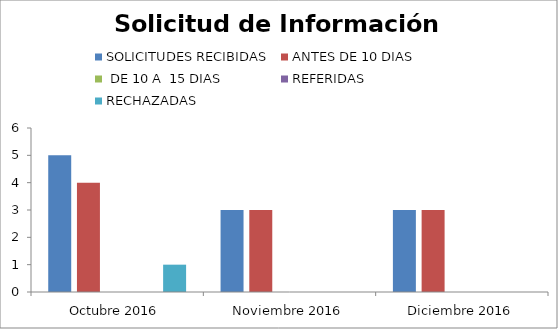
| Category | SOLICITUDES RECIBIDAS | ANTES DE 10 DIAS |  DE 10 A  15 DIAS  | REFERIDAS | RECHAZADAS |
|---|---|---|---|---|---|
| Octubre 2016 | 5 | 4 | 0 | 0 | 1 |
| Noviembre 2016 | 3 | 3 | 0 | 0 | 0 |
| Diciembre 2016 | 3 | 3 | 0 | 0 | 0 |